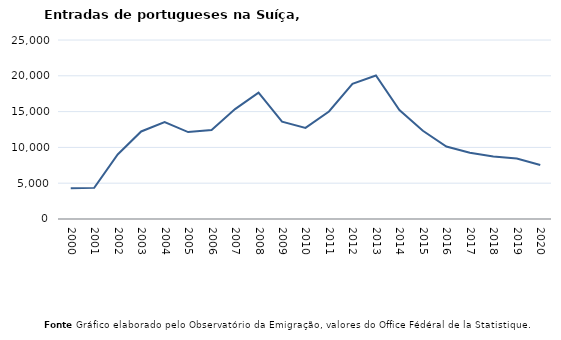
| Category | Entradas |
|---|---|
| 2000.0 | 4311 |
| 2001.0 | 4347 |
| 2002.0 | 9005 |
| 2003.0 | 12228 |
| 2004.0 | 13539 |
| 2005.0 | 12138 |
| 2006.0 | 12441 |
| 2007.0 | 15351 |
| 2008.0 | 17657 |
| 2009.0 | 13601 |
| 2010.0 | 12720 |
| 2011.0 | 15020 |
| 2012.0 | 18892 |
| 2013.0 | 20039 |
| 2014.0 | 15221 |
| 2015.0 | 12325 |
| 2016.0 | 10123 |
| 2017.0 | 9257 |
| 2018.0 | 8733 |
| 2019.0 | 8443 |
| 2020.0 | 7542 |